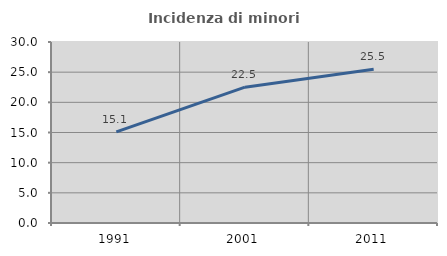
| Category | Incidenza di minori stranieri |
|---|---|
| 1991.0 | 15.094 |
| 2001.0 | 22.515 |
| 2011.0 | 25.496 |